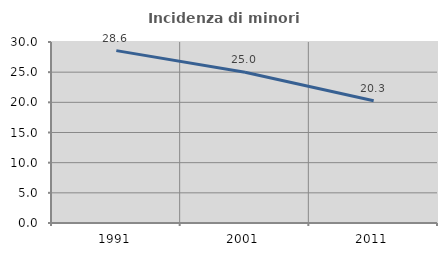
| Category | Incidenza di minori stranieri |
|---|---|
| 1991.0 | 28.571 |
| 2001.0 | 25 |
| 2011.0 | 20.253 |